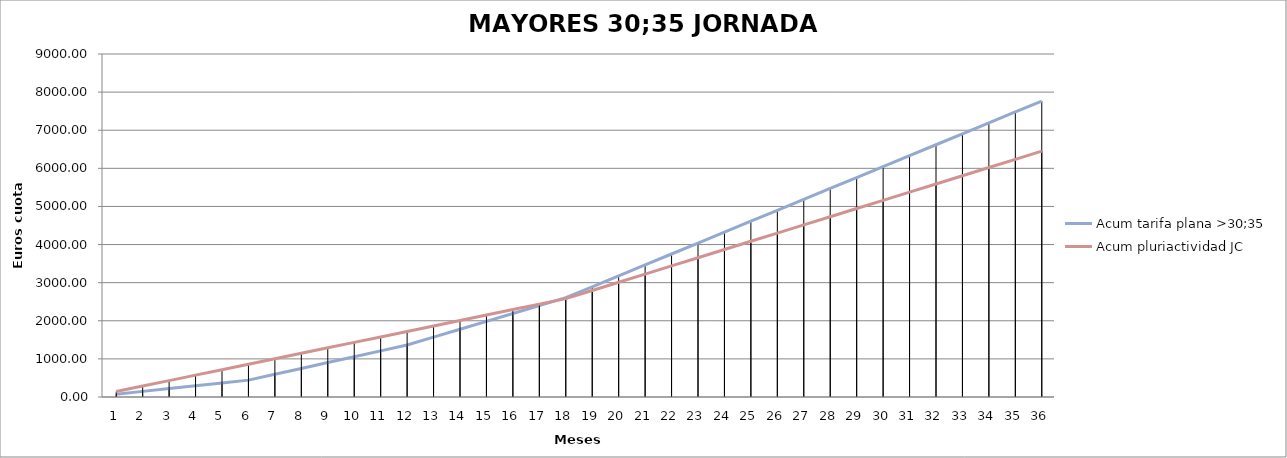
| Category | Acum tarifa plana >30;35 | Acum pluriactividad JC |
|---|---|---|
| 1.0 | 73.77 | 143.343 |
| 2.0 | 147.54 | 286.685 |
| 3.0 | 221.31 | 430.028 |
| 4.0 | 295.08 | 573.37 |
| 5.0 | 368.85 | 716.713 |
| 6.0 | 442.62 | 860.055 |
| 7.0 | 596.234 | 1003.398 |
| 8.0 | 749.847 | 1146.74 |
| 9.0 | 903.46 | 1290.083 |
| 10.0 | 1057.073 | 1433.426 |
| 11.0 | 1210.686 | 1576.768 |
| 12.0 | 1364.3 | 1720.111 |
| 13.0 | 1571.142 | 1863.453 |
| 14.0 | 1777.983 | 2006.796 |
| 15.0 | 1984.825 | 2150.138 |
| 16.0 | 2191.667 | 2293.481 |
| 17.0 | 2398.509 | 2436.823 |
| 18.0 | 2605.351 | 2580.166 |
| 19.0 | 2892.036 | 2795.18 |
| 20.0 | 3178.722 | 3010.194 |
| 21.0 | 3465.407 | 3225.207 |
| 22.0 | 3752.092 | 3440.221 |
| 23.0 | 4038.777 | 3655.235 |
| 24.0 | 4325.462 | 3870.249 |
| 25.0 | 4612.147 | 4085.263 |
| 26.0 | 4898.832 | 4300.277 |
| 27.0 | 5185.517 | 4515.29 |
| 28.0 | 5472.202 | 4730.304 |
| 29.0 | 5758.887 | 4945.318 |
| 30.0 | 6045.573 | 5160.332 |
| 31.0 | 6332.258 | 5375.346 |
| 32.0 | 6618.943 | 5590.359 |
| 33.0 | 6905.628 | 5805.373 |
| 34.0 | 7192.313 | 6020.387 |
| 35.0 | 7478.998 | 6235.401 |
| 36.0 | 7765.683 | 6450.415 |